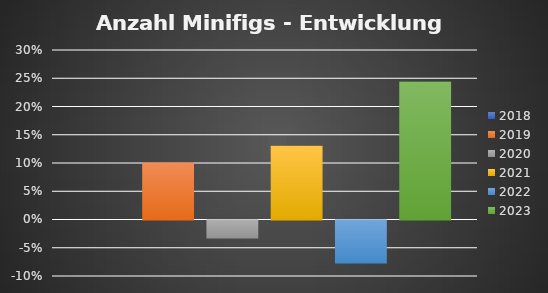
| Category | 2018 | 2019 | 2020 | 2021 | 2022 | 2023 |
|---|---|---|---|---|---|---|
| % mehr Minifigs |  | 0.101 | -0.032 | 0.131 | -0.076 | 0.244 |